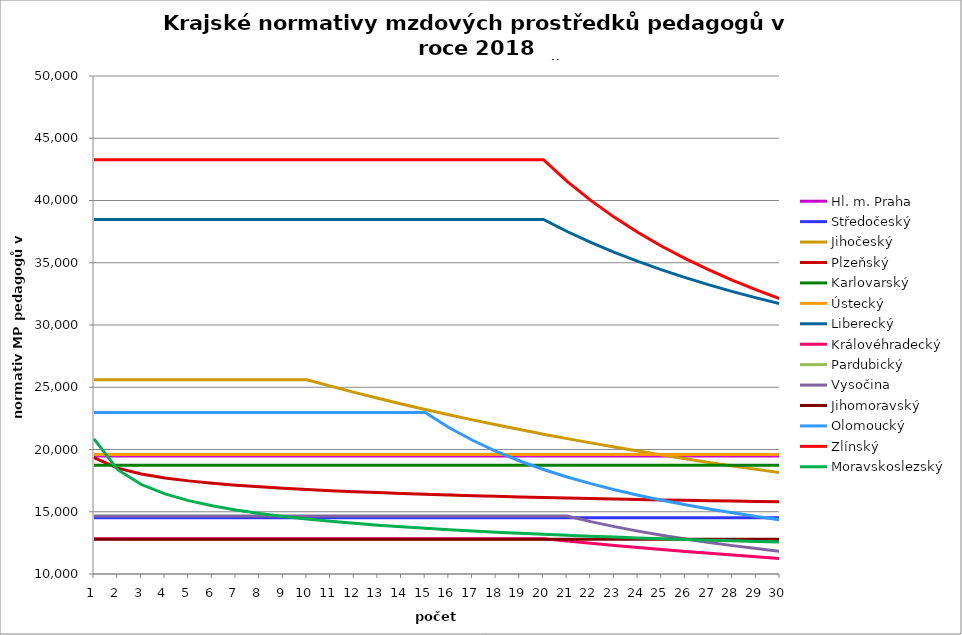
| Category | Hl. m. Praha | Středočeský | Jihočeský | Plzeňský | Karlovarský  | Ústecký   | Liberecký | Královéhradecký | Pardubický | Vysočina | Jihomoravský | Olomoucký | Zlínský | Moravskoslezský |
|---|---|---|---|---|---|---|---|---|---|---|---|---|---|---|
| 0 | 19479.538 | 14525.257 | 25604.931 | 19341.812 | 18733.333 | 19607.702 | 38475.29 | 12832.799 | 6567.12 | 14650.174 | 12794.049 | 22978.421 | 43279.031 | 20856.298 |
| 1 | 19479.538 | 14525.257 | 25604.931 | 18498.733 | 18733.333 | 19607.702 | 38475.29 | 12832.799 | 6567.12 | 14650.174 | 12794.049 | 22978.421 | 43279.031 | 18378.322 |
| 2 | 19479.538 | 14525.257 | 25604.931 | 18032.609 | 18733.333 | 19607.702 | 38475.29 | 12832.799 | 6567.12 | 14650.174 | 12794.049 | 22978.421 | 43279.031 | 17187.135 |
| 3 | 19479.538 | 14525.257 | 25604.931 | 17717.476 | 18733.333 | 19607.702 | 38475.29 | 12832.799 | 6567.12 | 14650.174 | 12794.049 | 22978.421 | 43279.031 | 16434.296 |
| 4 | 19479.538 | 14525.257 | 25604.931 | 17479.885 | 18733.333 | 19607.702 | 38475.29 | 12832.799 | 6567.12 | 14650.174 | 12794.049 | 22978.421 | 43279.031 | 15893.646 |
| 5 | 19479.538 | 14525.257 | 25604.931 | 17297.63 | 18733.333 | 19607.702 | 38475.29 | 12832.799 | 6567.12 | 14650.174 | 12794.049 | 22978.421 | 43279.031 | 15475.208 |
| 6 | 19479.538 | 14525.257 | 25604.931 | 17135.211 | 18733.333 | 19607.702 | 38475.29 | 12832.799 | 6567.12 | 14650.174 | 12794.049 | 22978.421 | 43279.031 | 15136.481 |
| 7 | 19479.538 | 14525.257 | 25604.931 | 17007.456 | 18733.333 | 19607.702 | 38475.29 | 12832.799 | 6567.12 | 14650.174 | 12794.049 | 22978.421 | 43279.031 | 14855.939 |
| 8 | 19479.538 | 14525.257 | 25604.931 | 16889.403 | 18733.333 | 19607.702 | 38475.29 | 12832.799 | 6567.12 | 14650.174 | 12794.049 | 22978.421 | 43279.031 | 14621.891 |
| 9 | 19479.538 | 14525.257 | 25604.931 | 16788.408 | 18733.333 | 19607.702 | 38475.29 | 12832.799 | 6567.12 | 14650.174 | 12794.049 | 22978.421 | 43279.031 | 14412.75 |
| 10 | 19479.538 | 14525.257 | 25088.177 | 16696.249 | 18733.333 | 19607.702 | 38475.29 | 12832.799 | 6567.12 | 14650.174 | 12794.049 | 22978.421 | 43279.031 | 14232.446 |
| 11 | 19479.538 | 14525.257 | 24591.867 | 16612.654 | 18733.333 | 19607.702 | 38475.29 | 12832.799 | 6567.12 | 14650.174 | 12794.049 | 22978.421 | 43279.031 | 14067.81 |
| 12 | 19479.538 | 14525.257 | 24114.814 | 16537.381 | 18733.333 | 19607.702 | 38475.29 | 12832.799 | 6567.12 | 14650.174 | 12794.049 | 22978.421 | 43279.031 | 13923.411 |
| 13 | 19479.538 | 14525.257 | 23655.917 | 16470.217 | 18733.333 | 19607.702 | 38475.29 | 12832.799 | 6567.12 | 14650.174 | 12794.049 | 22978.421 | 43279.031 | 13792.726 |
| 14 | 19479.538 | 14525.257 | 23214.159 | 16403.596 | 18733.333 | 19607.702 | 38475.29 | 12832.799 | 6567.12 | 14650.174 | 12794.049 | 22978.421 | 43279.031 | 13669.767 |
| 15 | 19479.538 | 14525.257 | 22788.597 | 16344.828 | 18733.333 | 19607.702 | 38475.29 | 12832.799 | 6567.12 | 14650.174 | 12794.049 | 21761.495 | 43279.031 | 13559.4 |
| 16 | 19479.538 | 14525.257 | 22378.358 | 16293.75 | 18733.333 | 19607.702 | 38475.29 | 12832.799 | 6567.12 | 14650.174 | 12794.049 | 20740.618 | 43279.031 | 13455.933 |
| 17 | 19479.538 | 14525.257 | 21982.627 | 16242.991 | 18733.333 | 19607.702 | 38475.29 | 12832.799 | 6567.12 | 14650.174 | 12794.049 | 19845 | 43279.031 | 13359.091 |
| 18 | 19479.538 | 14525.257 | 21600.649 | 16192.547 | 18733.333 | 19607.702 | 38475.29 | 12832.799 | 6567.12 | 14650.174 | 12794.049 | 19075.478 | 43279.031 | 13268.623 |
| 19 | 19479.538 | 14525.257 | 21231.72 | 16142.415 | 18733.333 | 19607.702 | 38475.29 | 12832.799 | 6567.12 | 14650.174 | 12794.049 | 18392.417 | 43279.031 | 13189.23 |
| 20 | 19479.538 | 14525.257 | 20875.181 | 16099.691 | 18733.333 | 19607.702 | 37510.962 | 12644.289 | 6567.12 | 14650.174 | 12794.049 | 17792.766 | 41540.661 | 13110.781 |
| 21 | 19479.538 | 14525.257 | 20530.418 | 16064.261 | 18733.333 | 19607.702 | 36635.47 | 12465.749 | 6567.12 | 14206.212 | 12794.049 | 17256.522 | 40008.432 | 13033.259 |
| 22 | 19479.538 | 14525.257 | 20196.859 | 16021.949 | 18733.333 | 19607.702 | 35836.251 | 12292.181 | 6567.12 | 13806.995 | 12794.049 | 16767.739 | 38646.336 | 12966.176 |
| 23 | 19479.538 | 14525.257 | 19873.965 | 15986.859 | 18733.333 | 19607.702 | 35103.059 | 12123.38 | 6567.12 | 13444.745 | 12794.049 | 16328.752 | 37426.384 | 12899.781 |
| 24 | 19479.538 | 14525.257 | 19561.233 | 15951.923 | 18733.333 | 19607.702 | 34427.448 | 11963.308 | 6567.12 | 13114.949 | 12794.049 | 15926.676 | 36326.481 | 12834.061 |
| 25 | 19479.538 | 14525.257 | 19258.19 | 15917.139 | 18733.333 | 19607.702 | 33802.39 | 11811.458 | 6567.12 | 12812.867 | 12794.049 | 15564.706 | 35328.946 | 12773.633 |
| 26 | 19479.538 | 14525.257 | 18964.394 | 15882.507 | 18733.333 | 19607.702 | 33221.985 | 11659.465 | 6567.12 | 12534.922 | 12794.049 | 15225.458 | 34419.453 | 12718.356 |
| 27 | 19479.538 | 14525.257 | 18679.427 | 15854.909 | 18733.333 | 19607.702 | 32681.241 | 11519.036 | 6567.12 | 12278.466 | 12794.049 | 14913.407 | 33586.271 | 12663.555 |
| 28 | 19479.538 | 14525.257 | 18402.898 | 15820.546 | 18733.333 | 19607.702 | 32175.904 | 11378.189 | 6567.12 | 12040.395 | 12794.049 | 14626.131 | 32819.696 | 12613.734 |
| 29 | 19479.538 | 14525.257 | 18134.436 | 15793.163 | 18733.333 | 19607.702 | 31702.323 | 11244.415 | 6567.12 | 11819.185 | 12794.049 | 14355.61 | 32111.627 | 12564.304 |